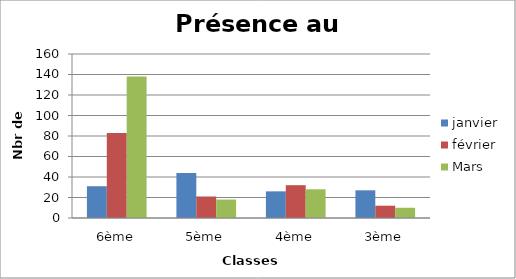
| Category | janvier | février | Mars |
|---|---|---|---|
| 6ème | 31 | 83 | 138 |
| 5ème | 44 | 21 | 18 |
| 4ème | 26 | 32 | 28 |
| 3ème | 27 | 12 | 10 |